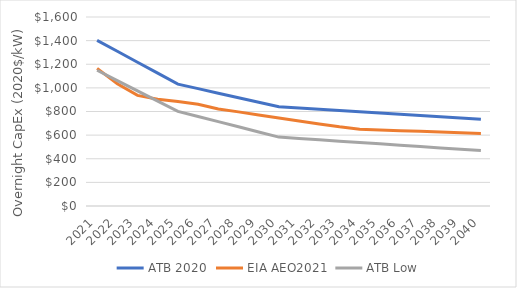
| Category | ATB 2020 | EIA AEO2021 | ATB Low |
|---|---|---|---|
| 2021.0 | 1402.465 | 1165.286 | 1149.025 |
| 2022.0 | 1309.851 | 1034.786 | 1062.027 |
| 2023.0 | 1217.237 | 936.709 | 975.029 |
| 2024.0 | 1124.623 | 902.997 | 888.032 |
| 2025.0 | 1032.009 | 885.075 | 801.034 |
| 2026.0 | 993.602 | 861.588 | 757.466 |
| 2027.0 | 955.194 | 821.82 | 713.897 |
| 2028.0 | 916.786 | 796.729 | 670.329 |
| 2029.0 | 878.378 | 771.071 | 626.761 |
| 2030.0 | 839.97 | 745.272 | 583.192 |
| 2031.0 | 829.471 | 720.083 | 571.782 |
| 2032.0 | 818.971 | 694.684 | 560.372 |
| 2033.0 | 808.471 | 670.354 | 548.962 |
| 2034.0 | 797.972 | 650.614 | 537.551 |
| 2035.0 | 787.472 | 644.111 | 526.141 |
| 2036.0 | 776.973 | 637.743 | 514.731 |
| 2037.0 | 766.473 | 631.894 | 503.32 |
| 2038.0 | 755.973 | 626.231 | 491.91 |
| 2039.0 | 745.474 | 620.522 | 480.5 |
| 2040.0 | 734.974 | 614.553 | 469.09 |